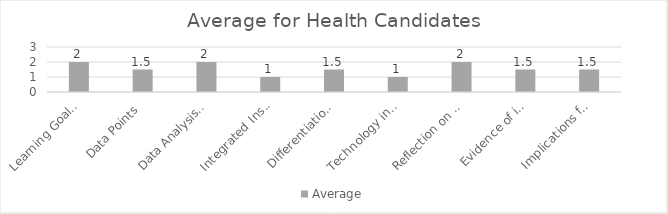
| Category | Average |
|---|---|
| Learning Goals Aligned with Pre-/Post-assessments ACEI 4.0 | 2 |
| Data Points | 1.5 |
| Data Analysis for Pedagogical Decisions ACEI 4.0 | 2 |
| Integrated Instruction ACEI 3.1 | 1 |
| Differentiation based on knowledge of individual learning ACEI 3.2 | 1.5 |
| Technology integration | 1 |
| Reflection on pedagogical decisions ACEI 1.0 | 2 |
| Evidence of impact on student learning ACEI 5.1 | 1.5 |
| Implications for teaching and professional development ACEI 5.1 | 1.5 |